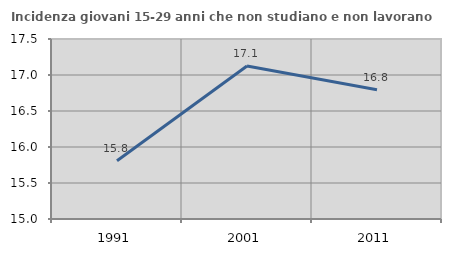
| Category | Incidenza giovani 15-29 anni che non studiano e non lavorano  |
|---|---|
| 1991.0 | 15.809 |
| 2001.0 | 17.125 |
| 2011.0 | 16.794 |